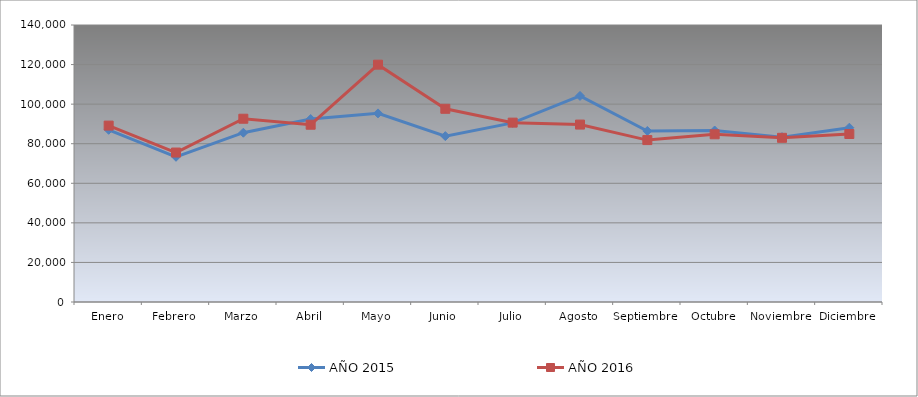
| Category | AÑO 2015 | AÑO 2016 |
|---|---|---|
| Enero | 87020.979 | 89157.598 |
| Febrero | 73389.258 | 75539.812 |
| Marzo | 85563.346 | 92625.971 |
| Abril | 92471.497 | 89598.285 |
| Mayo | 95332.475 | 119956.753 |
| Junio | 83842.416 | 97650.352 |
| Julio | 90536.129 | 90656.479 |
| Agosto | 104154.278 | 89674.453 |
| Septiembre | 86442.812 | 81831.849 |
| Octubre | 86673.536 | 84764.325 |
| Noviembre | 83318.537 | 82982.533 |
| Diciembre | 88095.882 | 84903.06 |